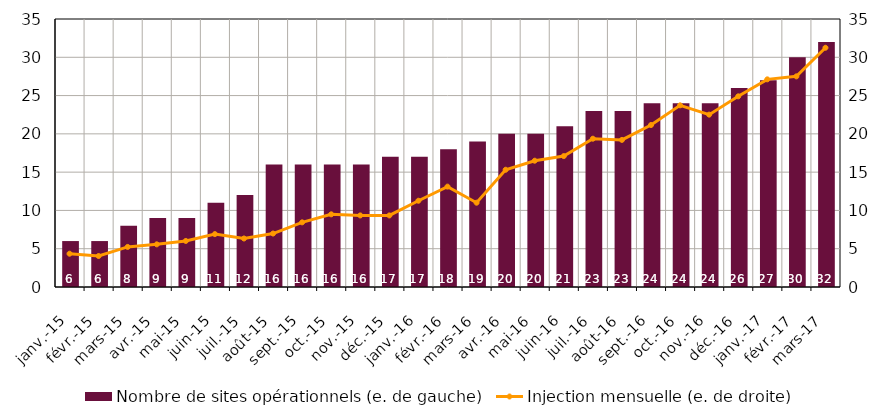
| Category | Nombre de sites opérationnels (e. de gauche) |
|---|---|
| 2015-01-01 | 6 |
| 2015-02-01 | 6 |
| 2015-03-01 | 8 |
| 2015-04-01 | 9 |
| 2015-05-01 | 9 |
| 2015-06-01 | 11 |
| 2015-07-01 | 12 |
| 2015-08-01 | 16 |
| 2015-09-01 | 16 |
| 2015-10-01 | 16 |
| 2015-11-01 | 16 |
| 2015-12-01 | 17 |
| 2016-01-01 | 17 |
| 2016-02-01 | 18 |
| 2016-03-01 | 19 |
| 2016-04-01 | 20 |
| 2016-05-01 | 20 |
| 2016-06-01 | 21 |
| 2016-07-01 | 23 |
| 2016-08-01 | 23 |
| 2016-09-01 | 24 |
| 2016-10-01 | 24 |
| 2016-11-01 | 24 |
| 2016-12-01 | 26 |
| 2017-01-01 | 27 |
| 2017-02-01 | 30 |
| 2017-03-01 | 32 |